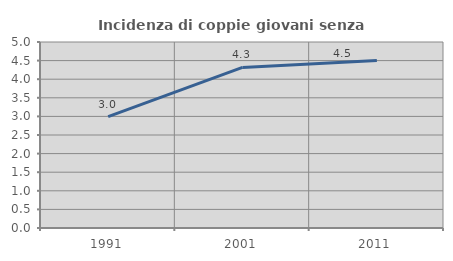
| Category | Incidenza di coppie giovani senza figli |
|---|---|
| 1991.0 | 2.994 |
| 2001.0 | 4.317 |
| 2011.0 | 4.505 |